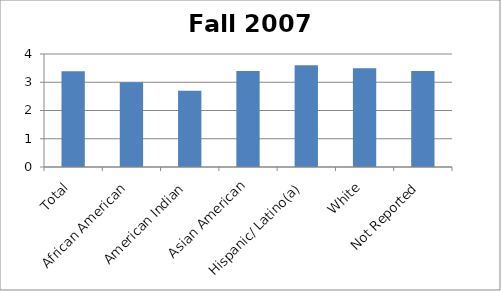
| Category | Fall 2007 GPA |
|---|---|
| Total | 3.393 |
| African American | 3 |
| American Indian | 2.7 |
| Asian American | 3.4 |
| Hispanic/ Latino(a) | 3.6 |
| White | 3.5 |
| Not Reported | 3.4 |